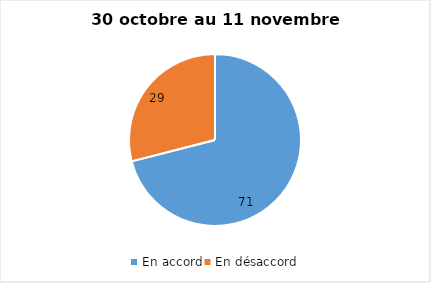
| Category | Series 0 |
|---|---|
| En accord | 71 |
| En désaccord | 29 |